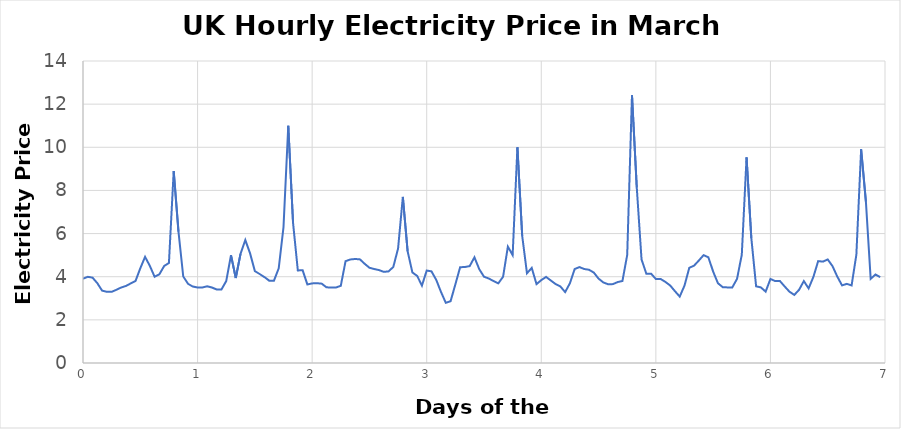
| Category | Series 0 |
|---|---|
| 0.0 | 3.906 |
| 0.041666666666666664 | 3.996 |
| 0.08333333333333333 | 3.957 |
| 0.125 | 3.7 |
| 0.16666666666666666 | 3.354 |
| 0.20833333333333331 | 3.3 |
| 0.24999999999999997 | 3.298 |
| 0.29166666666666663 | 3.395 |
| 0.3333333333333333 | 3.5 |
| 0.375 | 3.571 |
| 0.4166666666666667 | 3.69 |
| 0.45833333333333337 | 3.8 |
| 0.5 | 4.39 |
| 0.5416666666666666 | 4.921 |
| 0.5833333333333333 | 4.503 |
| 0.6249999999999999 | 3.998 |
| 0.6666666666666665 | 4.113 |
| 0.7083333333333331 | 4.496 |
| 0.7499999999999998 | 4.638 |
| 0.7916666666666664 | 8.9 |
| 0.833333333333333 | 6.093 |
| 0.8749999999999997 | 4.01 |
| 0.9166666666666663 | 3.67 |
| 0.9583333333333329 | 3.546 |
| 0.9999999999999996 | 3.505 |
| 1.0416666666666663 | 3.503 |
| 1.083333333333333 | 3.556 |
| 1.1249999999999998 | 3.5 |
| 1.1666666666666665 | 3.41 |
| 1.2083333333333333 | 3.41 |
| 1.25 | 3.797 |
| 1.2916666666666667 | 4.996 |
| 1.3333333333333335 | 3.94 |
| 1.3750000000000002 | 5.06 |
| 1.416666666666667 | 5.7 |
| 1.4583333333333337 | 5.08 |
| 1.5000000000000004 | 4.261 |
| 1.5416666666666672 | 4.126 |
| 1.583333333333334 | 3.985 |
| 1.6250000000000007 | 3.817 |
| 1.6666666666666674 | 3.818 |
| 1.7083333333333341 | 4.39 |
| 1.7500000000000009 | 6.3 |
| 1.7916666666666676 | 11 |
| 1.8333333333333344 | 6.5 |
| 1.875000000000001 | 4.29 |
| 1.9166666666666679 | 4.303 |
| 1.9583333333333346 | 3.641 |
| 2.0000000000000013 | 3.69 |
| 2.041666666666668 | 3.699 |
| 2.0833333333333344 | 3.679 |
| 2.125000000000001 | 3.508 |
| 2.1666666666666674 | 3.5 |
| 2.208333333333334 | 3.501 |
| 2.2500000000000004 | 3.578 |
| 2.291666666666667 | 4.72 |
| 2.3333333333333335 | 4.8 |
| 2.375 | 4.821 |
| 2.4166666666666665 | 4.806 |
| 2.458333333333333 | 4.6 |
| 2.4999999999999996 | 4.415 |
| 2.541666666666666 | 4.357 |
| 2.5833333333333326 | 4.308 |
| 2.624999999999999 | 4.225 |
| 2.6666666666666656 | 4.247 |
| 2.708333333333332 | 4.452 |
| 2.7499999999999987 | 5.307 |
| 2.791666666666665 | 7.7 |
| 2.8333333333333317 | 5.179 |
| 2.8749999999999982 | 4.197 |
| 2.9166666666666647 | 4.037 |
| 2.9583333333333313 | 3.59 |
| 2.999999999999998 | 4.286 |
| 3.0416666666666643 | 4.248 |
| 3.083333333333331 | 3.851 |
| 3.1249999999999973 | 3.289 |
| 3.166666666666664 | 2.789 |
| 3.2083333333333304 | 2.866 |
| 3.249999999999997 | 3.643 |
| 3.2916666666666634 | 4.44 |
| 3.33333333333333 | 4.45 |
| 3.3749999999999964 | 4.492 |
| 3.416666666666663 | 4.9 |
| 3.4583333333333295 | 4.351 |
| 3.499999999999996 | 4 |
| 3.5416666666666625 | 3.917 |
| 3.583333333333329 | 3.798 |
| 3.6249999999999956 | 3.692 |
| 3.666666666666662 | 4 |
| 3.7083333333333286 | 5.394 |
| 3.749999999999995 | 5 |
| 3.7916666666666616 | 10 |
| 3.833333333333328 | 5.9 |
| 3.8749999999999947 | 4.16 |
| 3.916666666666661 | 4.408 |
| 3.9583333333333277 | 3.657 |
| 3.9999999999999942 | 3.842 |
| 4.041666666666661 | 3.992 |
| 4.083333333333328 | 3.824 |
| 4.124999999999995 | 3.658 |
| 4.166666666666662 | 3.548 |
| 4.208333333333329 | 3.287 |
| 4.249999999999996 | 3.697 |
| 4.2916666666666625 | 4.357 |
| 4.3333333333333295 | 4.446 |
| 4.3749999999999964 | 4.357 |
| 4.416666666666663 | 4.322 |
| 4.45833333333333 | 4.192 |
| 4.499999999999997 | 3.911 |
| 4.541666666666664 | 3.735 |
| 4.583333333333331 | 3.65 |
| 4.624999999999998 | 3.657 |
| 4.666666666666665 | 3.752 |
| 4.708333333333332 | 3.802 |
| 4.749999999999999 | 5.01 |
| 4.791666666666666 | 12.415 |
| 4.833333333333333 | 8.143 |
| 4.875 | 4.8 |
| 4.916666666666667 | 4.141 |
| 4.958333333333334 | 4.141 |
| 5.000000000000001 | 3.894 |
| 5.041666666666668 | 3.895 |
| 5.083333333333335 | 3.759 |
| 5.125000000000002 | 3.593 |
| 5.166666666666669 | 3.329 |
| 5.208333333333336 | 3.079 |
| 5.250000000000003 | 3.588 |
| 5.29166666666667 | 4.413 |
| 5.333333333333337 | 4.512 |
| 5.3750000000000036 | 4.75 |
| 5.4166666666666705 | 5 |
| 5.4583333333333375 | 4.9 |
| 5.500000000000004 | 4.239 |
| 5.541666666666671 | 3.699 |
| 5.583333333333338 | 3.516 |
| 5.625000000000005 | 3.504 |
| 5.666666666666672 | 3.5 |
| 5.708333333333339 | 3.898 |
| 5.750000000000006 | 5.014 |
| 5.791666666666673 | 9.532 |
| 5.83333333333334 | 5.79 |
| 5.875000000000007 | 3.555 |
| 5.916666666666674 | 3.505 |
| 5.958333333333341 | 3.309 |
| 6.000000000000008 | 3.896 |
| 6.041666666666675 | 3.797 |
| 6.083333333333342 | 3.797 |
| 6.125000000000009 | 3.544 |
| 6.166666666666676 | 3.303 |
| 6.208333333333343 | 3.155 |
| 6.25000000000001 | 3.394 |
| 6.291666666666677 | 3.798 |
| 6.333333333333344 | 3.458 |
| 6.375000000000011 | 3.992 |
| 6.416666666666678 | 4.723 |
| 6.458333333333345 | 4.7 |
| 6.5000000000000115 | 4.8 |
| 6.5416666666666785 | 4.492 |
| 6.5833333333333455 | 4.009 |
| 6.625000000000012 | 3.598 |
| 6.666666666666679 | 3.668 |
| 6.708333333333346 | 3.594 |
| 6.750000000000013 | 5.019 |
| 6.79166666666668 | 9.91 |
| 6.833333333333347 | 7.482 |
| 6.875000000000014 | 3.897 |
| 6.916666666666681 | 4.1 |
| 6.958333333333348 | 3.982 |